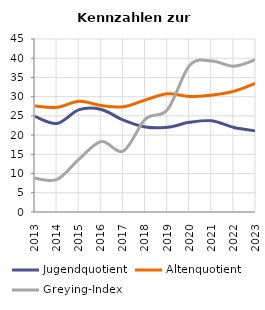
| Category | Jugendquotient | Altenquotient | Greying-Index |
|---|---|---|---|
| 2013.0 | 24.865 | 27.568 | 8.772 |
| 2014.0 | 23.037 | 27.225 | 8.475 |
| 2015.0 | 26.63 | 28.804 | 13.793 |
| 2016.0 | 26.667 | 27.692 | 18.333 |
| 2017.0 | 23.881 | 27.363 | 15.873 |
| 2018.0 | 22.111 | 29.146 | 24.194 |
| 2019.0 | 22.051 | 30.769 | 26.667 |
| 2020.0 | 23.32 | 30.05 | 38.18 |
| 2021.0 | 23.711 | 30.412 | 39.286 |
| 2022.0 | 21.99 | 31.41 | 37.93 |
| 2023.0 | 21.081 | 33.514 | 39.655 |